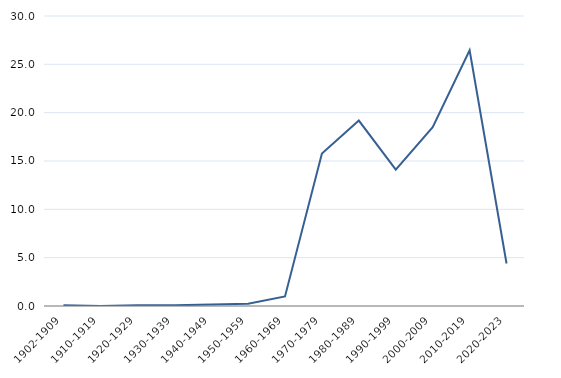
| Category | Percentagem |
|---|---|
| 1902-1909 | 0.076 |
| 1910-1919 | 0 |
| 1920-1929 | 0.076 |
| 1930-1939 | 0.076 |
| 1940-1949 | 0.152 |
| 1950-1959 | 0.227 |
| 1960-1969 | 0.986 |
| 1970-1979 | 15.77 |
| 1980-1989 | 19.181 |
| 1990-1999 | 14.102 |
| 2000-2009 | 18.499 |
| 2010-2019 | 26.459 |
| 2020-2023 | 4.397 |